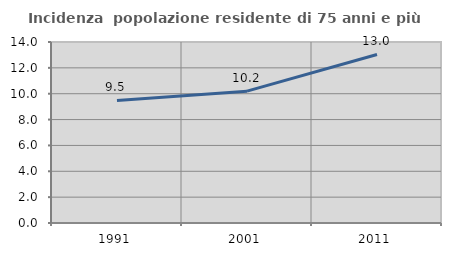
| Category | Incidenza  popolazione residente di 75 anni e più |
|---|---|
| 1991.0 | 9.476 |
| 2001.0 | 10.198 |
| 2011.0 | 13.037 |